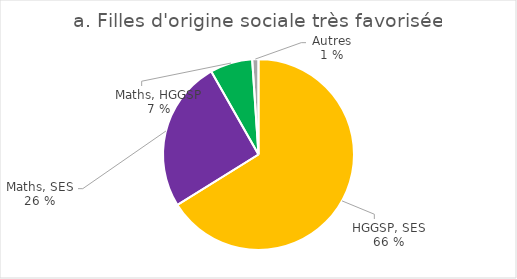
| Category | Filles d'origine sociale très favorisée |
|---|---|
| HGGSP, SES | 4684 |
| Mathématiques, SES | 1815 |
| Mathématiques, HGGSP | 508 |
| Autres | 75 |